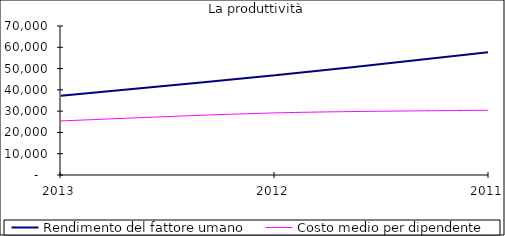
| Category | Rendimento del fattore umano | Costo medio per dipendente |
|---|---|---|
| 2013.0 | 37195.652 | 25413.043 |
| 2012.0 | 46854.167 | 29166.667 |
| 2011.0 | 57700 | 30420 |